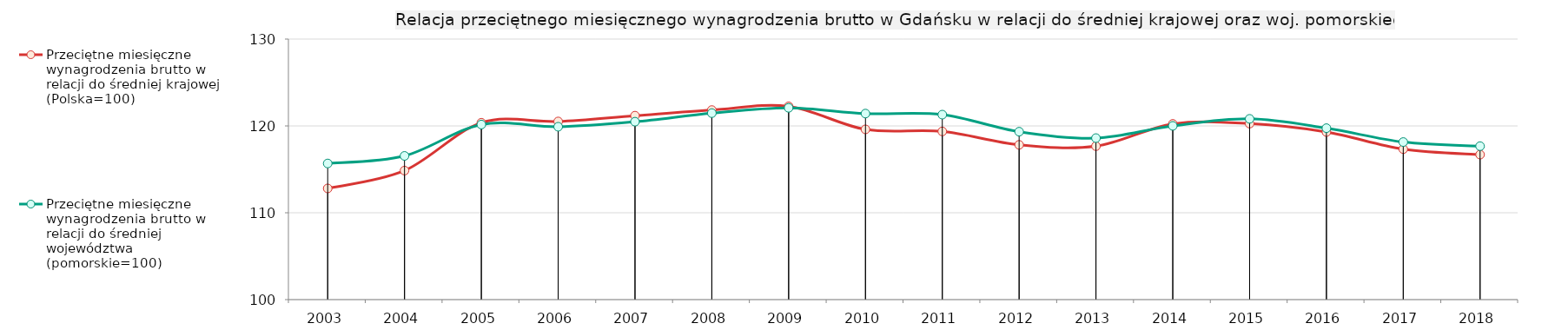
| Category | Przeciętne miesięczne wynagrodzenia brutto w relacji do średniej krajowej (Polska=100) | Przeciętne miesięczne wynagrodzenia brutto w relacji do średniej województwa (pomorskie=100) |
|---|---|---|
| 2003.0 | 112.803 | 115.676 |
| 2004.0 | 114.856 | 116.548 |
| 2005.0 | 120.364 | 120.157 |
| 2006.0 | 120.513 | 119.904 |
| 2007.0 | 121.18 | 120.486 |
| 2008.0 | 121.828 | 121.473 |
| 2009.0 | 122.254 | 122.081 |
| 2010.0 | 119.603 | 121.421 |
| 2011.0 | 119.368 | 121.3 |
| 2012.0 | 117.822 | 119.336 |
| 2013.0 | 117.672 | 118.599 |
| 2014.0 | 120.234 | 120.006 |
| 2015.0 | 120.267 | 120.813 |
| 2016.0 | 119.3 | 119.741 |
| 2017.0 | 117.328 | 118.143 |
| 2018.0 | 116.697 | 117.671 |